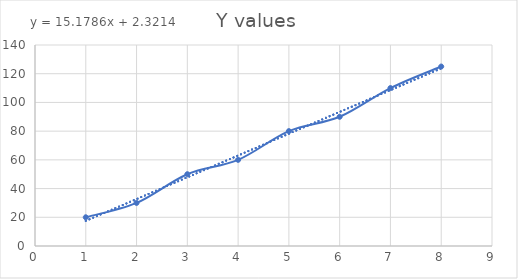
| Category | Y values |
|---|---|
| 1.0 | 20 |
| 2.0 | 30 |
| 3.0 | 50 |
| 4.0 | 60 |
| 5.0 | 80 |
| 6.0 | 90 |
| 7.0 | 110 |
| 8.0 | 125 |